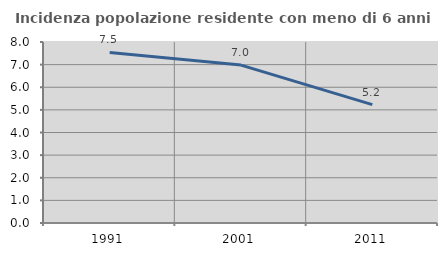
| Category | Incidenza popolazione residente con meno di 6 anni |
|---|---|
| 1991.0 | 7.54 |
| 2001.0 | 6.98 |
| 2011.0 | 5.23 |